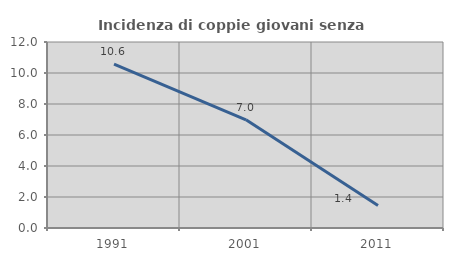
| Category | Incidenza di coppie giovani senza figli |
|---|---|
| 1991.0 | 10.577 |
| 2001.0 | 6.977 |
| 2011.0 | 1.449 |